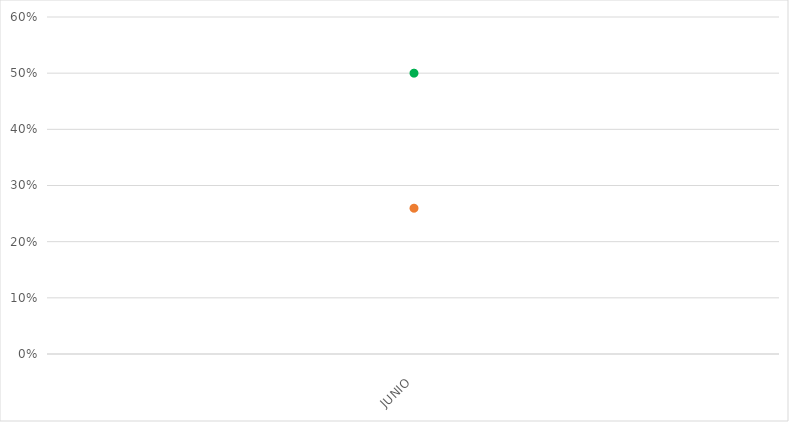
| Category | VALOR  | META PONDERADA |
|---|---|---|
| JUNIO | 0.26 | 0.5 |